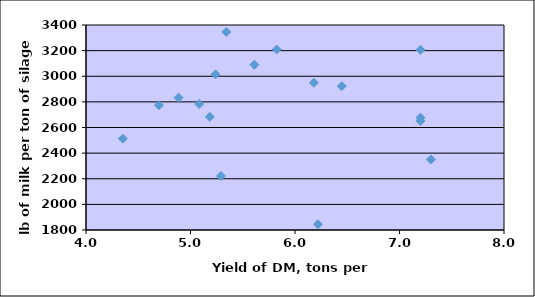
| Category | Series 0 |
|---|---|
| 5.23974533 | 3015 |
| 5.18453251 | 2683.5 |
| 7.2 | 3206 |
| 5.61077298 | 3090 |
| 7.2 | 2651.25 |
| 4.35190269 | 2512.75 |
| 7.3 | 2350 |
| 5.34292214 | 3346 |
| 5.08340775 | 2783.25 |
| 4.69765501 | 2773.25 |
| 4.8858623 | 2833.25 |
| 6.44814853 | 2922.75 |
| 6.18058251 | 2948.75 |
| 5.82470564 | 3209 |
| 6.21913715 | 1844.75 |
| 7.2 | 2677 |
| 5.29132217 | 2221.5 |